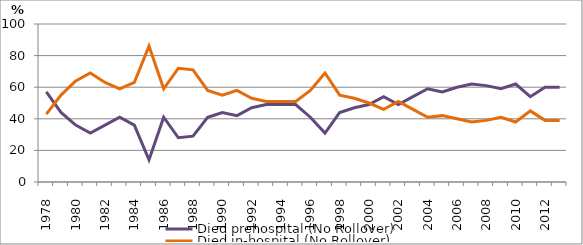
| Category | Died prehospital (No Rollover) | Died in-hospital (No Rollover) |
|---|---|---|
| 1978.0 | 57 | 43 |
| 1979.0 | 44 | 55 |
| 1980.0 | 36 | 64 |
| 1981.0 | 31 | 69 |
| 1982.0 | 36 | 63 |
| 1983.0 | 41 | 59 |
| 1984.0 | 36 | 63 |
| 1985.0 | 14 | 86 |
| 1986.0 | 41 | 59 |
| 1987.0 | 28 | 72 |
| 1988.0 | 29 | 71 |
| 1989.0 | 41 | 58 |
| 1990.0 | 44 | 55 |
| 1991.0 | 42 | 58 |
| 1992.0 | 47 | 53 |
| 1993.0 | 49 | 51 |
| 1994.0 | 49 | 51 |
| 1995.0 | 49 | 51 |
| 1996.0 | 41 | 58 |
| 1997.0 | 31 | 69 |
| 1998.0 | 44 | 55 |
| 1999.0 | 47 | 53 |
| 2000.0 | 49 | 50 |
| 2001.0 | 54 | 46 |
| 2002.0 | 49 | 51 |
| 2003.0 | 54 | 46 |
| 2004.0 | 59 | 41 |
| 2005.0 | 57 | 42 |
| 2006.0 | 60 | 40 |
| 2007.0 | 62 | 38 |
| 2008.0 | 61 | 39 |
| 2009.0 | 59 | 41 |
| 2010.0 | 62 | 38 |
| 2011.0 | 54 | 45 |
| 2012.0 | 60 | 39 |
| 2013.0 | 60 | 39 |